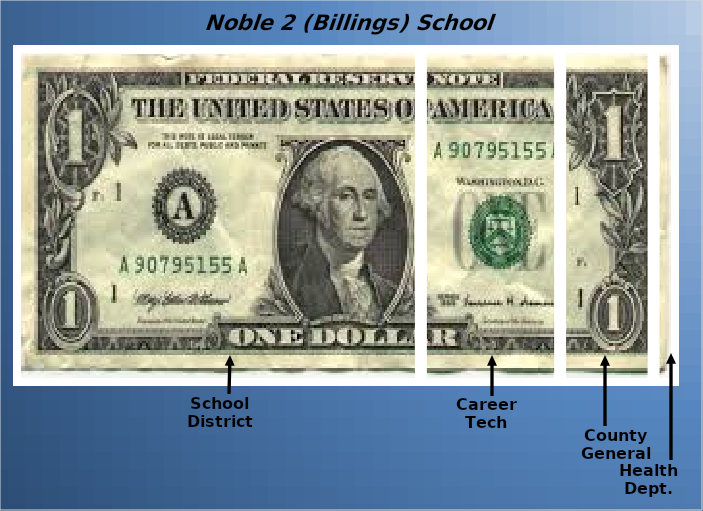
| Category | School District | Career Tech | County General | Health Dept. |
|---|---|---|---|---|
| 0 | 0.613 | 0.21 | 0.141 | 0.035 |